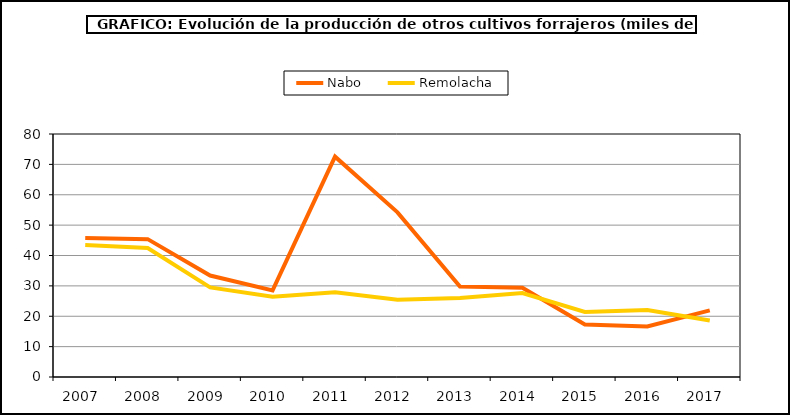
| Category | Nabo | Remolacha |
|---|---|---|
| 2007.0 | 45.793 | 43.418 |
| 2008.0 | 45.389 | 42.447 |
| 2009.0 | 33.407 | 29.491 |
| 2010.0 | 28.523 | 26.462 |
| 2011.0 | 72.547 | 27.888 |
| 2012.0 | 54.203 | 25.459 |
| 2013.0 | 29.799 | 26.019 |
| 2014.0 | 29.363 | 27.616 |
| 2015.0 | 17.256 | 21.393 |
| 2016.0 | 16.64 | 22.03 |
| 2017.0 | 21.935 | 18.58 |